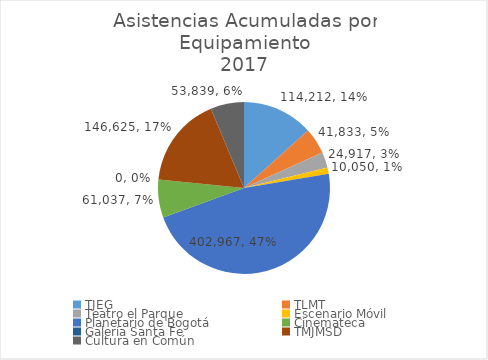
| Category | Series 0 |
|---|---|
| TJEG | 114212 |
| TLMT | 41833 |
| Teatro el Parque | 24917 |
| Escenario Móvil | 10050 |
| Planetario de Bogotá | 402967 |
| Cinemateca | 61037 |
| Galería Santa Fe | 0 |
| TMJMSD | 146625 |
| Cultura en Común | 53839 |